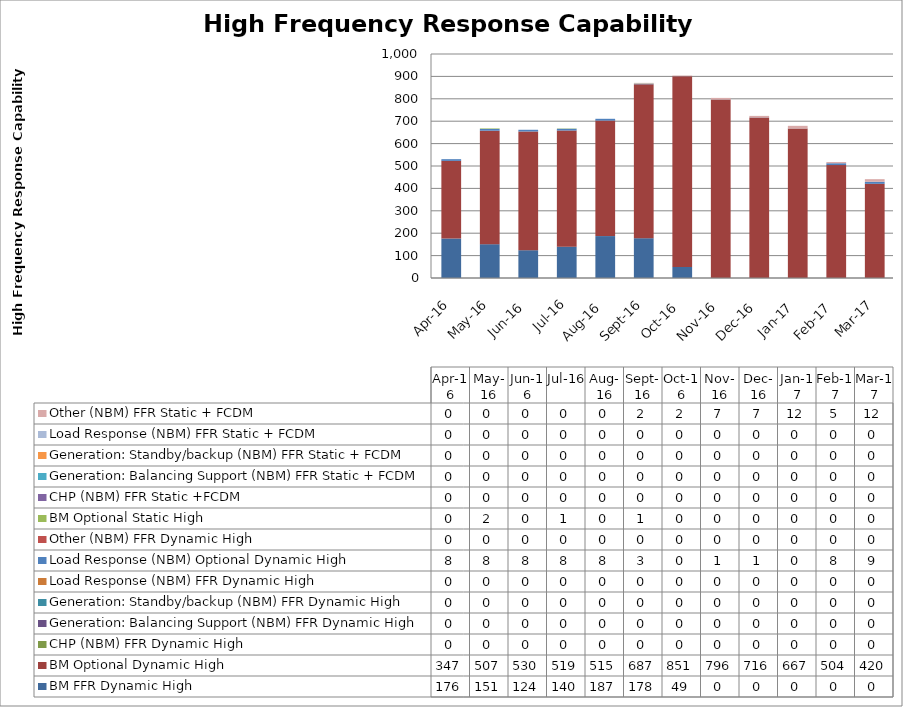
| Category | BM FFR Dynamic High | BM Optional Dynamic High | CHP (NBM) FFR Dynamic High | Generation: Balancing Support (NBM) FFR Dynamic High | Generation: Standby/backup (NBM) FFR Dynamic High | Load Response (NBM) FFR Dynamic High | Load Response (NBM) Optional Dynamic High | Other (NBM) FFR Dynamic High | BM Optional Static High | CHP (NBM) FFR Static +FCDM | Generation: Balancing Support (NBM) FFR Static + FCDM | Generation: Standby/backup (NBM) FFR Static + FCDM | Load Response (NBM) FFR Static + FCDM | Other (NBM) FFR Static + FCDM |
|---|---|---|---|---|---|---|---|---|---|---|---|---|---|---|
| 2016-04-01 | 176.295 | 346.606 | 0 | 0 | 0 | 0 | 7.564 | 0 | 0 | 0 | 0 | 0 | 0 | 0 |
| 2016-05-01 | 150.96 | 506.565 | 0 | 0 | 0 | 0 | 8.054 | 0 | 2.346 | 0 | 0 | 0 | 0 | 0 |
| 2016-06-01 | 124.084 | 530.007 | 0 | 0 | 0 | 0 | 7.616 | 0 | 0 | 0 | 0 | 0 | 0 | 0 |
| 2016-07-01 | 139.872 | 518.52 | 0 | 0 | 0 | 0 | 7.87 | 0 | 1.331 | 0 | 0 | 0 | 0 | 0 |
| 2016-08-01 | 187.138 | 515.497 | 0 | 0 | 0 | 0 | 8.094 | 0 | 0 | 0 | 0 | 0 | 0 | 0 |
| 2016-09-01 | 177.614 | 687.364 | 0 | 0 | 0 | 0 | 2.64 | 0 | 1.119 | 0 | 0 | 0 | 0 | 2.33 |
| 2016-10-01 | 49.496 | 851.204 | 0 | 0 | 0 | 0 | 0.405 | 0 | 0 | 0 | 0 | 0 | 0 | 2.49 |
| 2016-11-01 | 0 | 796.394 | 0 | 0 | 0 | 0 | 0.512 | 0 | 0 | 0 | 0 | 0 | 0 | 7.13 |
| 2016-12-01 | 0 | 716.429 | 0 | 0 | 0 | 0 | 0.552 | 0 | 0 | 0 | 0 | 0 | 0 | 6.72 |
| 2017-01-01 | 0 | 666.929 | 0 | 0 | 0 | 0 | 0.3 | 0 | 0 | 0 | 0 | 0 | 0 | 12.12 |
| 2017-02-01 | 0 | 504.125 | 0 | 0 | 0 | 0 | 8.262 | 0 | 0 | 0 | 0 | 0 | 0 | 5.34 |
| 2017-03-01 | 0 | 420.44 | 0 | 0 | 0 | 0 | 9.27 | 0 | 0 | 0 | 0 | 0 | 0 | 11.51 |